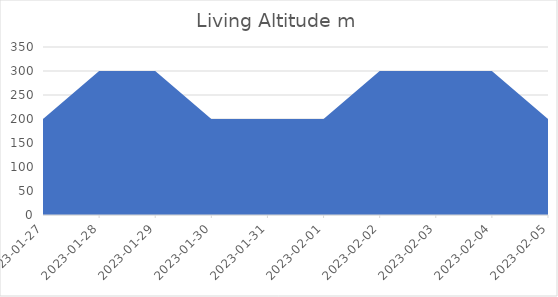
| Category | Living Altitude m |
|---|---|
| 2023-01-27 | 200 |
| 2023-01-28 | 300 |
| 2023-01-29 | 300 |
| 2023-01-30 | 200 |
| 2023-01-31 | 200 |
| 2023-02-01 | 200 |
| 2023-02-02 | 300 |
| 2023-02-03 | 300 |
| 2023-02-04 | 300 |
| 2023-02-05 | 200 |